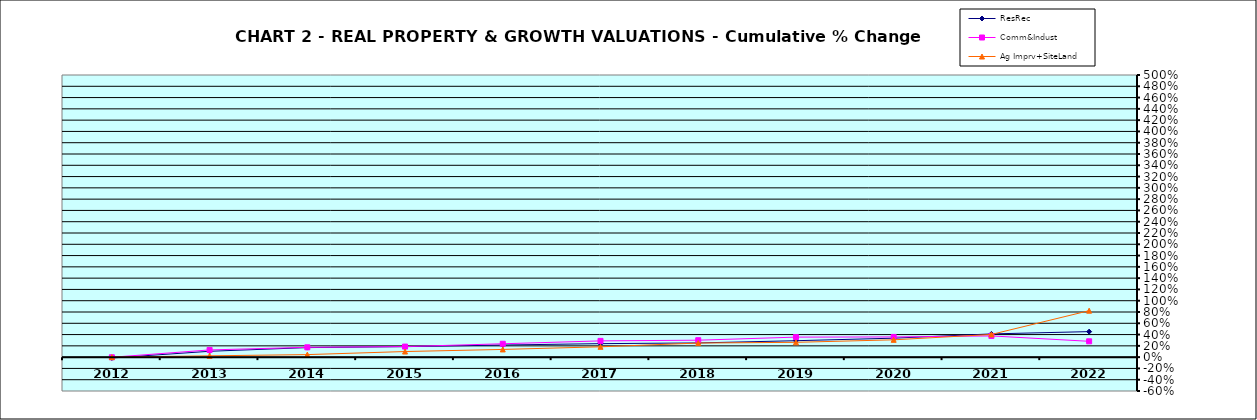
| Category | ResRec | Comm&Indust | Ag Imprv+SiteLand |
|---|---|---|---|
| 2012.0 | -0.015 | -0.002 | 0 |
| 2013.0 | 0.104 | 0.128 | 0.024 |
| 2014.0 | 0.169 | 0.174 | 0.045 |
| 2015.0 | 0.186 | 0.187 | 0.099 |
| 2016.0 | 0.215 | 0.237 | 0.137 |
| 2017.0 | 0.239 | 0.288 | 0.183 |
| 2018.0 | 0.252 | 0.3 | 0.25 |
| 2019.0 | 0.291 | 0.355 | 0.263 |
| 2020.0 | 0.336 | 0.358 | 0.307 |
| 2021.0 | 0.412 | 0.376 | 0.402 |
| 2022.0 | 0.452 | 0.281 | 0.823 |